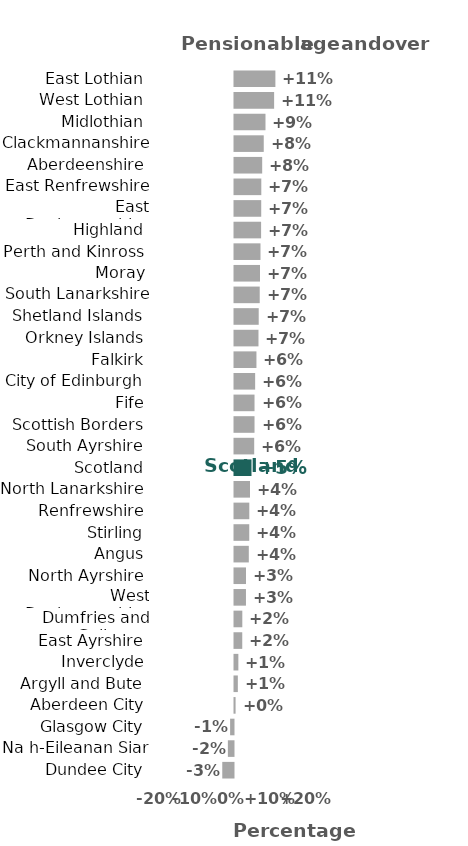
| Category | Series 0 |
|---|---|
| Dundee City | -3.141 |
| Na h-Eileanan Siar | -1.574 |
| Glasgow City | -0.943 |
| Aberdeen City | 0.305 |
| Argyll and Bute | 0.933 |
| Inverclyde | 1.079 |
| East Ayrshire | 2.168 |
| Dumfries and Galloway | 2.187 |
| West Dunbartonshire | 3.204 |
| North Ayrshire | 3.213 |
| Angus | 3.999 |
| Stirling | 4.127 |
| Renfrewshire | 4.142 |
| North Lanarkshire | 4.341 |
| Scotland | 4.753 |
| South Ayrshire | 5.515 |
| Scottish Borders | 5.599 |
| Fife | 5.6 |
| City of Edinburgh | 5.777 |
| Falkirk | 6.137 |
| Orkney Islands | 6.71 |
| Shetland Islands | 6.773 |
| South Lanarkshire | 7.055 |
| Moray | 7.135 |
| Perth and Kinross | 7.271 |
| Highland | 7.439 |
| East Dunbartonshire | 7.475 |
| East Renfrewshire | 7.499 |
| Aberdeenshire | 7.745 |
| Clackmannanshire | 8.181 |
| Midlothian | 8.67 |
| West Lothian | 11.087 |
| East Lothian | 11.438 |